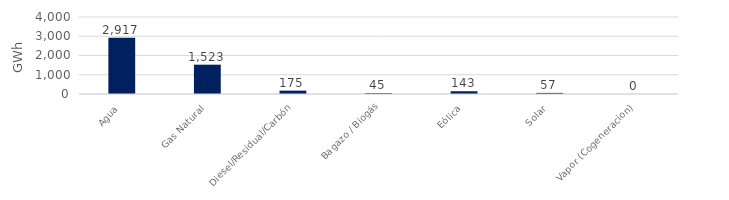
| Category | Series 0 |
|---|---|
| Agua | 2916.764 |
| Gas Natural | 1522.926 |
| Diesel/Residual/Carbón | 174.654 |
| Bagazo / Biogás | 44.857 |
| Eólica | 142.651 |
| Solar | 57.417 |
| Vapor (Cogeneracion) | 0.35 |